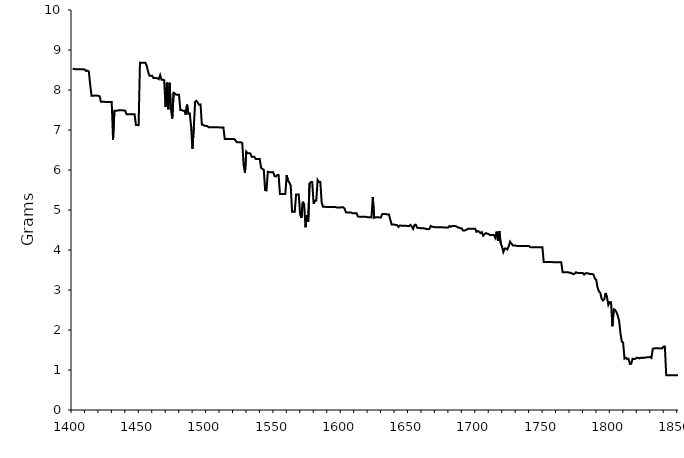
| Category | Series 1 |
|---|---|
| 1400.0 | 8.534 |
| 1401.0 | 8.524 |
| 1402.0 | 8.521 |
| 1403.0 | 8.521 |
| 1404.0 | 8.519 |
| 1405.0 | 8.519 |
| 1406.0 | 8.519 |
| 1407.0 | 8.519 |
| 1408.0 | 8.516 |
| 1409.0 | 8.516 |
| 1410.0 | 8.476 |
| 1411.0 | 8.484 |
| 1412.0 | 8.466 |
| 1413.0 | 8.137 |
| 1414.0 | 7.859 |
| 1415.0 | 7.859 |
| 1416.0 | 7.859 |
| 1417.0 | 7.862 |
| 1418.0 | 7.859 |
| 1419.0 | 7.856 |
| 1420.0 | 7.845 |
| 1421.0 | 7.705 |
| 1422.0 | 7.705 |
| 1423.0 | 7.705 |
| 1424.0 | 7.703 |
| 1425.0 | 7.703 |
| 1426.0 | 7.703 |
| 1427.0 | 7.703 |
| 1428.0 | 7.702 |
| 1429.0 | 7.702 |
| 1430.0 | 6.76 |
| 1431.0 | 7.483 |
| 1432.0 | 7.483 |
| 1433.0 | 7.483 |
| 1434.0 | 7.493 |
| 1435.0 | 7.493 |
| 1436.0 | 7.493 |
| 1437.0 | 7.493 |
| 1438.0 | 7.488 |
| 1439.0 | 7.484 |
| 1440.0 | 7.392 |
| 1441.0 | 7.395 |
| 1442.0 | 7.393 |
| 1443.0 | 7.393 |
| 1444.0 | 7.393 |
| 1445.0 | 7.393 |
| 1446.0 | 7.393 |
| 1447.0 | 7.123 |
| 1448.0 | 7.123 |
| 1449.0 | 7.12 |
| 1450.0 | 8.681 |
| 1451.0 | 8.681 |
| 1452.0 | 8.68 |
| 1453.0 | 8.68 |
| 1454.0 | 8.68 |
| 1455.0 | 8.61 |
| 1456.0 | 8.463 |
| 1457.0 | 8.359 |
| 1458.0 | 8.359 |
| 1459.0 | 8.359 |
| 1460.0 | 8.299 |
| 1461.0 | 8.299 |
| 1462.0 | 8.299 |
| 1463.0 | 8.291 |
| 1464.0 | 8.271 |
| 1465.0 | 8.374 |
| 1466.0 | 8.257 |
| 1467.0 | 8.257 |
| 1468.0 | 8.245 |
| 1469.0 | 7.573 |
| 1470.0 | 8.184 |
| 1471.0 | 7.517 |
| 1472.0 | 8.181 |
| 1473.0 | 7.512 |
| 1474.0 | 7.286 |
| 1475.0 | 7.93 |
| 1476.0 | 7.915 |
| 1477.0 | 7.881 |
| 1478.0 | 7.881 |
| 1479.0 | 7.881 |
| 1480.0 | 7.498 |
| 1481.0 | 7.498 |
| 1482.0 | 7.482 |
| 1483.0 | 7.482 |
| 1484.0 | 7.382 |
| 1485.0 | 7.633 |
| 1486.0 | 7.404 |
| 1487.0 | 7.411 |
| 1488.0 | 7.087 |
| 1489.0 | 6.531 |
| 1490.0 | 7.07 |
| 1491.0 | 7.708 |
| 1492.0 | 7.731 |
| 1493.0 | 7.682 |
| 1494.0 | 7.628 |
| 1495.0 | 7.637 |
| 1496.0 | 7.131 |
| 1497.0 | 7.129 |
| 1498.0 | 7.104 |
| 1499.0 | 7.103 |
| 1500.0 | 7.102 |
| 1501.0 | 7.067 |
| 1502.0 | 7.067 |
| 1503.0 | 7.067 |
| 1504.0 | 7.067 |
| 1505.0 | 7.067 |
| 1506.0 | 7.067 |
| 1507.0 | 7.067 |
| 1508.0 | 7.067 |
| 1509.0 | 7.065 |
| 1510.0 | 7.065 |
| 1511.0 | 7.065 |
| 1512.0 | 7.065 |
| 1513.0 | 6.773 |
| 1514.0 | 6.773 |
| 1515.0 | 6.773 |
| 1516.0 | 6.773 |
| 1517.0 | 6.773 |
| 1518.0 | 6.773 |
| 1519.0 | 6.773 |
| 1520.0 | 6.773 |
| 1521.0 | 6.739 |
| 1522.0 | 6.692 |
| 1523.0 | 6.692 |
| 1524.0 | 6.691 |
| 1525.0 | 6.691 |
| 1526.0 | 6.676 |
| 1527.0 | 6.131 |
| 1528.0 | 5.932 |
| 1529.0 | 6.459 |
| 1530.0 | 6.419 |
| 1531.0 | 6.419 |
| 1532.0 | 6.415 |
| 1533.0 | 6.33 |
| 1534.0 | 6.33 |
| 1535.0 | 6.33 |
| 1536.0 | 6.275 |
| 1537.0 | 6.275 |
| 1538.0 | 6.275 |
| 1539.0 | 6.275 |
| 1540.0 | 6.053 |
| 1541.0 | 6.027 |
| 1542.0 | 6.008 |
| 1543.0 | 5.495 |
| 1544.0 | 5.49 |
| 1545.0 | 5.957 |
| 1546.0 | 5.946 |
| 1547.0 | 5.946 |
| 1548.0 | 5.946 |
| 1549.0 | 5.946 |
| 1550.0 | 5.849 |
| 1551.0 | 5.838 |
| 1552.0 | 5.875 |
| 1553.0 | 5.874 |
| 1554.0 | 5.398 |
| 1555.0 | 5.398 |
| 1556.0 | 5.398 |
| 1557.0 | 5.398 |
| 1558.0 | 5.398 |
| 1559.0 | 5.872 |
| 1560.0 | 5.728 |
| 1561.0 | 5.686 |
| 1562.0 | 5.613 |
| 1563.0 | 4.955 |
| 1564.0 | 4.955 |
| 1565.0 | 4.955 |
| 1566.0 | 5.385 |
| 1567.0 | 5.385 |
| 1568.0 | 5.385 |
| 1569.0 | 4.89 |
| 1570.0 | 4.802 |
| 1571.0 | 5.204 |
| 1572.0 | 5.13 |
| 1573.0 | 4.568 |
| 1574.0 | 4.864 |
| 1575.0 | 4.707 |
| 1576.0 | 5.663 |
| 1577.0 | 5.699 |
| 1578.0 | 5.7 |
| 1579.0 | 5.156 |
| 1580.0 | 5.236 |
| 1581.0 | 5.237 |
| 1582.0 | 5.751 |
| 1583.0 | 5.699 |
| 1584.0 | 5.699 |
| 1585.0 | 5.19 |
| 1586.0 | 5.081 |
| 1587.0 | 5.078 |
| 1588.0 | 5.078 |
| 1589.0 | 5.078 |
| 1590.0 | 5.078 |
| 1591.0 | 5.078 |
| 1592.0 | 5.078 |
| 1593.0 | 5.077 |
| 1594.0 | 5.077 |
| 1595.0 | 5.077 |
| 1596.0 | 5.065 |
| 1597.0 | 5.063 |
| 1598.0 | 5.064 |
| 1599.0 | 5.064 |
| 1600.0 | 5.069 |
| 1601.0 | 5.067 |
| 1602.0 | 5.037 |
| 1603.0 | 4.942 |
| 1604.0 | 4.94 |
| 1605.0 | 4.94 |
| 1606.0 | 4.94 |
| 1607.0 | 4.939 |
| 1608.0 | 4.916 |
| 1609.0 | 4.916 |
| 1610.0 | 4.916 |
| 1611.0 | 4.916 |
| 1612.0 | 4.835 |
| 1613.0 | 4.833 |
| 1614.0 | 4.833 |
| 1615.0 | 4.833 |
| 1616.0 | 4.833 |
| 1617.0 | 4.832 |
| 1618.0 | 4.83 |
| 1619.0 | 4.82 |
| 1620.0 | 4.82 |
| 1621.0 | 4.82 |
| 1622.0 | 4.814 |
| 1623.0 | 5.324 |
| 1624.0 | 4.803 |
| 1625.0 | 4.819 |
| 1626.0 | 4.82 |
| 1627.0 | 4.818 |
| 1628.0 | 4.812 |
| 1629.0 | 4.812 |
| 1630.0 | 4.897 |
| 1631.0 | 4.899 |
| 1632.0 | 4.899 |
| 1633.0 | 4.892 |
| 1634.0 | 4.89 |
| 1635.0 | 4.887 |
| 1636.0 | 4.756 |
| 1637.0 | 4.639 |
| 1638.0 | 4.637 |
| 1639.0 | 4.635 |
| 1640.0 | 4.627 |
| 1641.0 | 4.623 |
| 1642.0 | 4.575 |
| 1643.0 | 4.612 |
| 1644.0 | 4.609 |
| 1645.0 | 4.606 |
| 1646.0 | 4.603 |
| 1647.0 | 4.607 |
| 1648.0 | 4.604 |
| 1649.0 | 4.602 |
| 1650.0 | 4.597 |
| 1651.0 | 4.628 |
| 1652.0 | 4.584 |
| 1653.0 | 4.526 |
| 1654.0 | 4.629 |
| 1655.0 | 4.63 |
| 1656.0 | 4.557 |
| 1657.0 | 4.553 |
| 1658.0 | 4.548 |
| 1659.0 | 4.545 |
| 1660.0 | 4.546 |
| 1661.0 | 4.541 |
| 1662.0 | 4.533 |
| 1663.0 | 4.526 |
| 1664.0 | 4.521 |
| 1665.0 | 4.524 |
| 1666.0 | 4.6 |
| 1667.0 | 4.582 |
| 1668.0 | 4.578 |
| 1669.0 | 4.571 |
| 1670.0 | 4.571 |
| 1671.0 | 4.569 |
| 1672.0 | 4.569 |
| 1673.0 | 4.569 |
| 1674.0 | 4.568 |
| 1675.0 | 4.566 |
| 1676.0 | 4.564 |
| 1677.0 | 4.563 |
| 1678.0 | 4.562 |
| 1679.0 | 4.56 |
| 1680.0 | 4.599 |
| 1681.0 | 4.581 |
| 1682.0 | 4.601 |
| 1683.0 | 4.601 |
| 1684.0 | 4.6 |
| 1685.0 | 4.591 |
| 1686.0 | 4.567 |
| 1687.0 | 4.561 |
| 1688.0 | 4.545 |
| 1689.0 | 4.545 |
| 1690.0 | 4.49 |
| 1691.0 | 4.488 |
| 1692.0 | 4.495 |
| 1693.0 | 4.515 |
| 1694.0 | 4.532 |
| 1695.0 | 4.532 |
| 1696.0 | 4.532 |
| 1697.0 | 4.532 |
| 1698.0 | 4.532 |
| 1699.0 | 4.534 |
| 1700.0 | 4.456 |
| 1701.0 | 4.474 |
| 1702.0 | 4.455 |
| 1703.0 | 4.423 |
| 1704.0 | 4.447 |
| 1705.0 | 4.357 |
| 1706.0 | 4.396 |
| 1707.0 | 4.421 |
| 1708.0 | 4.409 |
| 1709.0 | 4.4 |
| 1710.0 | 4.374 |
| 1711.0 | 4.374 |
| 1712.0 | 4.374 |
| 1713.0 | 4.374 |
| 1714.0 | 4.306 |
| 1715.0 | 4.46 |
| 1716.0 | 4.23 |
| 1717.0 | 4.474 |
| 1718.0 | 4.174 |
| 1719.0 | 4.079 |
| 1720.0 | 3.95 |
| 1721.0 | 4.035 |
| 1722.0 | 4.035 |
| 1723.0 | 4.014 |
| 1724.0 | 4.095 |
| 1725.0 | 4.208 |
| 1726.0 | 4.16 |
| 1727.0 | 4.115 |
| 1728.0 | 4.115 |
| 1729.0 | 4.114 |
| 1730.0 | 4.101 |
| 1731.0 | 4.101 |
| 1732.0 | 4.101 |
| 1733.0 | 4.101 |
| 1734.0 | 4.101 |
| 1735.0 | 4.101 |
| 1736.0 | 4.101 |
| 1737.0 | 4.101 |
| 1738.0 | 4.099 |
| 1739.0 | 4.099 |
| 1740.0 | 4.069 |
| 1741.0 | 4.069 |
| 1742.0 | 4.069 |
| 1743.0 | 4.069 |
| 1744.0 | 4.069 |
| 1745.0 | 4.069 |
| 1746.0 | 4.069 |
| 1747.0 | 4.069 |
| 1748.0 | 4.069 |
| 1749.0 | 4.069 |
| 1750.0 | 3.699 |
| 1751.0 | 3.698 |
| 1752.0 | 3.698 |
| 1753.0 | 3.698 |
| 1754.0 | 3.698 |
| 1755.0 | 3.698 |
| 1756.0 | 3.698 |
| 1757.0 | 3.696 |
| 1758.0 | 3.696 |
| 1759.0 | 3.696 |
| 1760.0 | 3.696 |
| 1761.0 | 3.696 |
| 1762.0 | 3.696 |
| 1763.0 | 3.696 |
| 1764.0 | 3.447 |
| 1765.0 | 3.446 |
| 1766.0 | 3.446 |
| 1767.0 | 3.446 |
| 1768.0 | 3.446 |
| 1769.0 | 3.43 |
| 1770.0 | 3.43 |
| 1771.0 | 3.413 |
| 1772.0 | 3.397 |
| 1773.0 | 3.411 |
| 1774.0 | 3.443 |
| 1775.0 | 3.427 |
| 1776.0 | 3.427 |
| 1777.0 | 3.427 |
| 1778.0 | 3.427 |
| 1779.0 | 3.427 |
| 1780.0 | 3.384 |
| 1781.0 | 3.417 |
| 1782.0 | 3.417 |
| 1783.0 | 3.417 |
| 1784.0 | 3.401 |
| 1785.0 | 3.401 |
| 1786.0 | 3.401 |
| 1787.0 | 3.384 |
| 1788.0 | 3.285 |
| 1789.0 | 3.251 |
| 1790.0 | 3.061 |
| 1791.0 | 2.967 |
| 1792.0 | 2.931 |
| 1793.0 | 2.782 |
| 1794.0 | 2.736 |
| 1795.0 | 2.772 |
| 1796.0 | 2.925 |
| 1797.0 | 2.817 |
| 1798.0 | 2.628 |
| 1799.0 | 2.698 |
| 1800.0 | 2.693 |
| 1801.0 | 2.096 |
| 1802.0 | 2.519 |
| 1803.0 | 2.502 |
| 1804.0 | 2.449 |
| 1805.0 | 2.358 |
| 1806.0 | 2.234 |
| 1807.0 | 1.922 |
| 1808.0 | 1.715 |
| 1809.0 | 1.681 |
| 1810.0 | 1.286 |
| 1811.0 | 1.308 |
| 1812.0 | 1.274 |
| 1813.0 | 1.284 |
| 1814.0 | 1.151 |
| 1815.0 | 1.155 |
| 1816.0 | 1.282 |
| 1817.0 | 1.272 |
| 1818.0 | 1.279 |
| 1819.0 | 1.304 |
| 1820.0 | 1.305 |
| 1821.0 | 1.29 |
| 1822.0 | 1.305 |
| 1823.0 | 1.302 |
| 1824.0 | 1.31 |
| 1825.0 | 1.307 |
| 1826.0 | 1.315 |
| 1827.0 | 1.317 |
| 1828.0 | 1.316 |
| 1829.0 | 1.328 |
| 1830.0 | 1.302 |
| 1831.0 | 1.53 |
| 1832.0 | 1.539 |
| 1833.0 | 1.542 |
| 1834.0 | 1.546 |
| 1835.0 | 1.546 |
| 1836.0 | 1.537 |
| 1837.0 | 1.546 |
| 1838.0 | 1.54 |
| 1839.0 | 1.582 |
| 1840.0 | 1.588 |
| 1841.0 | 0.868 |
| 1842.0 | 0.868 |
| 1843.0 | 0.868 |
| 1844.0 | 0.869 |
| 1845.0 | 0.869 |
| 1846.0 | 0.868 |
| 1847.0 | 0.868 |
| 1848.0 | 0.868 |
| 1849.0 | 0.868 |
| 1850.0 | 0.867 |